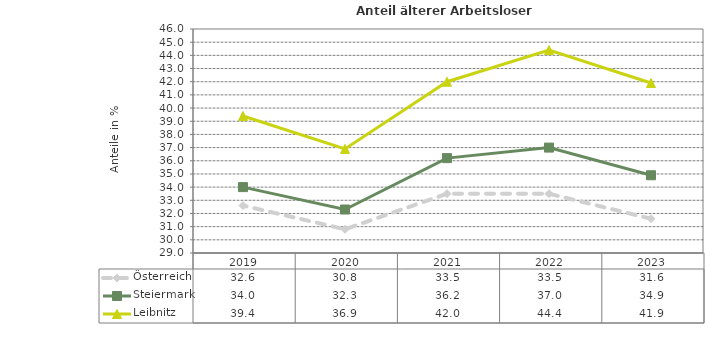
| Category | Österreich | Steiermark | Leibnitz |
|---|---|---|---|
| 2023.0 | 31.6 | 34.9 | 41.9 |
| 2022.0 | 33.5 | 37 | 44.4 |
| 2021.0 | 33.5 | 36.2 | 42 |
| 2020.0 | 30.8 | 32.3 | 36.9 |
| 2019.0 | 32.6 | 34 | 39.4 |